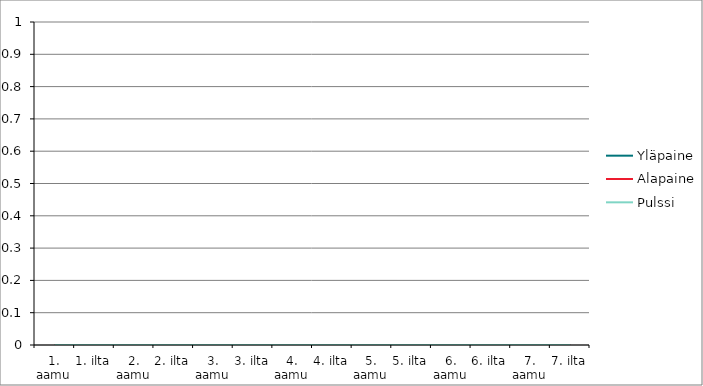
| Category | Yläpaine | Alapaine | Pulssi |
|---|---|---|---|
| 1. aamu | 0 | 0 | 0 |
| 1. ilta | 0 | 0 | 0 |
| 2. aamu | 0 | 0 | 0 |
| 2. ilta | 0 | 0 | 0 |
| 3. aamu | 0 | 0 | 0 |
| 3. ilta | 0 | 0 | 0 |
| 4. aamu | 0 | 0 | 0 |
| 4. ilta | 0 | 0 | 0 |
| 5. aamu | 0 | 0 | 0 |
| 5. ilta | 0 | 0 | 0 |
| 6. aamu | 0 | 0 | 0 |
| 6. ilta | 0 | 0 | 0 |
| 7. aamu | 0 | 0 | 0 |
| 7. ilta | 0 | 0 | 0 |